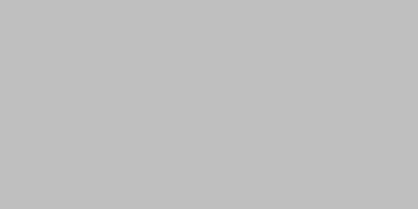
| Category | Income |
|---|---|
| 0 | 0 |
| 1 | 0 |
| 2 | 0 |
| 3 | 0 |
| 4 | 0 |
| 5 | 0 |
| 6 | 0 |
| 7 | 0 |
| 8 | 0 |
| 9 | 0 |
| 10 | 0 |
| 11 | 0 |
| 12 | 0 |
| 13 | 0 |
| 14 | 0 |
| 15 | 0 |
| 16 | 0 |
| 17 | 0 |
| 18 | 0 |
| 19 | 0 |
| 20 | 0 |
| 21 | 0 |
| 22 | 0 |
| 23 | 0 |
| 24 | 0 |
| 25 | 0 |
| 26 | 0 |
| 27 | 0 |
| 28 | 0 |
| 29 | 0 |
| 30 | 0 |
| 31 | 0 |
| 32 | 0 |
| 33 | 0 |
| 34 | 0 |
| 35 | 0 |
| 36 | 0 |
| 37 | 0 |
| 38 | 0 |
| 39 | 0 |
| 40 | 0 |
| 41 | 0 |
| 42 | 0 |
| 43 | 0 |
| 44 | 0 |
| 45 | 0 |
| 46 | 0 |
| 47 | 0 |
| 48 | 0 |
| 49 | 0 |
| 50 | 0 |
| 51 | 0 |
| 52 | 0 |
| 53 | 0 |
| 54 | 0 |
| 55 | 0 |
| 56 | 0 |
| 57 | 0 |
| 58 | 0 |
| 59 | 0 |
| 60 | 0 |
| 61 | 0 |
| 62 | 0 |
| 63 | 0 |
| 64 | 0 |
| 65 | 0 |
| 66 | 0 |
| 67 | 0 |
| 68 | 0 |
| 69 | 0 |
| 70 | 0 |
| 71 | 0 |
| 72 | 0 |
| 73 | 0 |
| 74 | 0 |
| 75 | 0 |
| 76 | 0 |
| 77 | 0 |
| 78 | 0 |
| 79 | 0 |
| 80 | 0 |
| 81 | 0 |
| 82 | 0 |
| 83 | 0 |
| 84 | 0 |
| 85 | 0 |
| 86 | 0 |
| 87 | 0 |
| 88 | 0 |
| 89 | 0 |
| 90 | 0 |
| 91 | 0 |
| 92 | 0 |
| 93 | 0 |
| 94 | 0 |
| 95 | 0 |
| 96 | 0 |
| 97 | 0 |
| 98 | 0 |
| 99 | 0 |
| 100 | 0 |
| 101 | 0 |
| 102 | 0 |
| 103 | 0 |
| 104 | 0 |
| 105 | 0 |
| 106 | 0 |
| 107 | 0 |
| 108 | 0 |
| 109 | 0 |
| 110 | 0 |
| 111 | 0 |
| 112 | 0 |
| 113 | 0 |
| 114 | 0 |
| 115 | 0 |
| 116 | 0 |
| 117 | 0 |
| 118 | 0 |
| 119 | 0 |
| 120 | 0 |